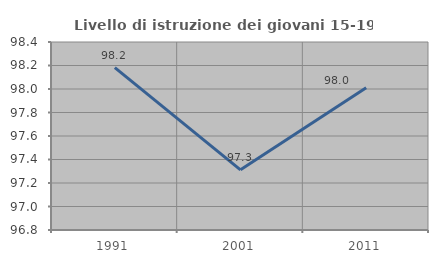
| Category | Livello di istruzione dei giovani 15-19 anni |
|---|---|
| 1991.0 | 98.182 |
| 2001.0 | 97.312 |
| 2011.0 | 98.01 |